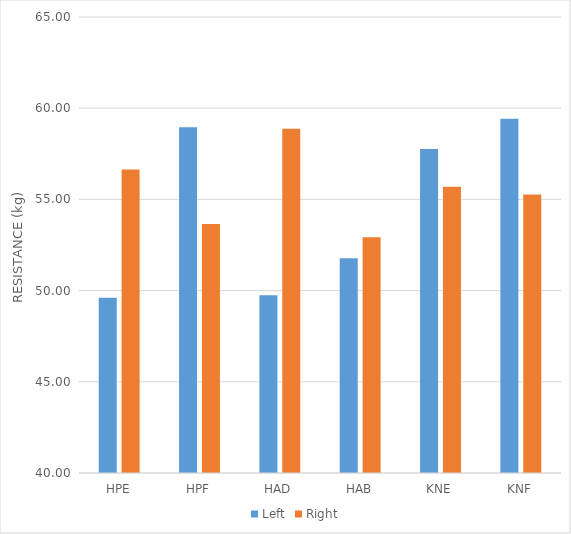
| Category | Left | Right |
|---|---|---|
| HPE | 49.61 | 56.64 |
| HPF | 58.96 | 53.65 |
| HAD | 49.74 | 58.88 |
| HAB | 51.77 | 52.92 |
| KNE | 57.77 | 55.7 |
| KNF | 59.42 | 55.27 |